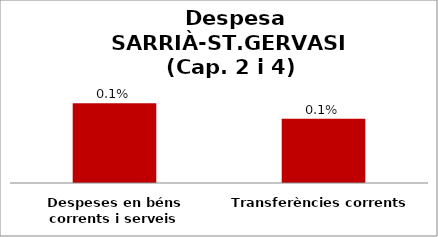
| Category | Series 0 |
|---|---|
| Despeses en béns corrents i serveis | 0.001 |
| Transferències corrents | 0.001 |